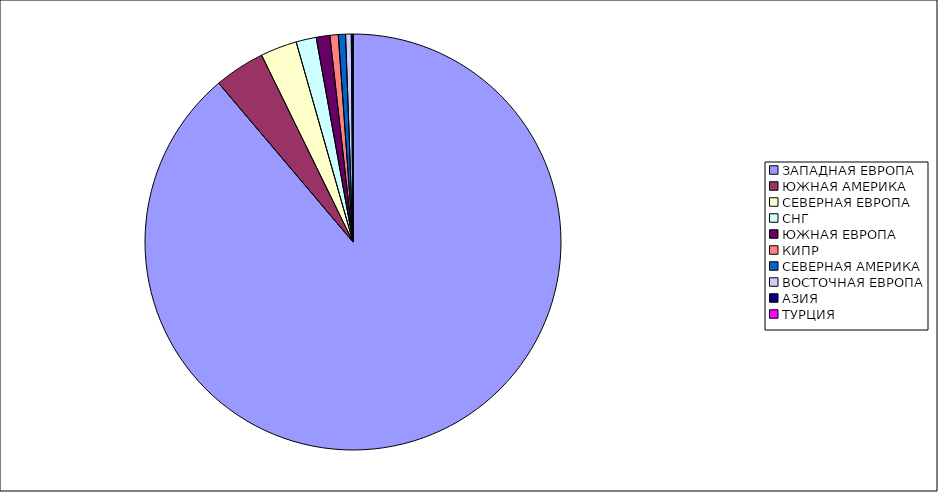
| Category | Оборот |
|---|---|
| ЗАПАДНАЯ ЕВРОПА | 0.888 |
| ЮЖНАЯ АМЕРИКА | 0.039 |
| СЕВЕРНАЯ ЕВРОПА | 0.028 |
| СНГ | 0.016 |
| ЮЖНАЯ ЕВРОПА | 0.011 |
| КИПР | 0.006 |
| СЕВЕРНАЯ АМЕРИКА | 0.006 |
| ВОСТОЧНАЯ ЕВРОПА | 0.004 |
| АЗИЯ | 0.001 |
| ТУРЦИЯ | 0 |